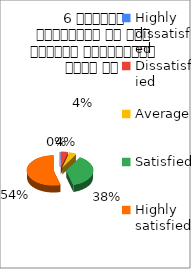
| Category | 6 शिक्षक समयनिष्ट है एवं नियमित व्याख्यान देते है  |
|---|---|
| Highly dissatisfied | 0 |
| Dissatisfied | 1 |
| Average | 1 |
| Satisfied | 9 |
| Highly satisfied | 13 |